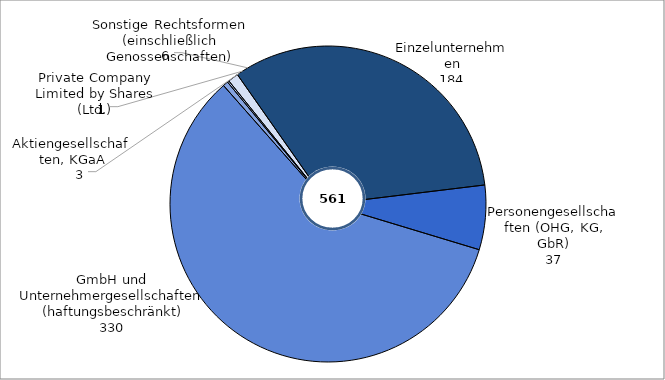
| Category | Series 0 |
|---|---|
| Einzelunternehmen | 184 |
| Personengesellschaften (OHG, KG, GbR) | 37 |
| Gesellschaften m.b.H. (einschließlich Unternehmergesellschaften (haftungsbeschränkt)) | 330 |
| Aktiengesellschaften, KGaA | 3 |
| Private Company Limited by Shares (Ltd.) | 1 |
| Sonstige Rechtsformen (einschließlich Genossenschaften) | 6 |